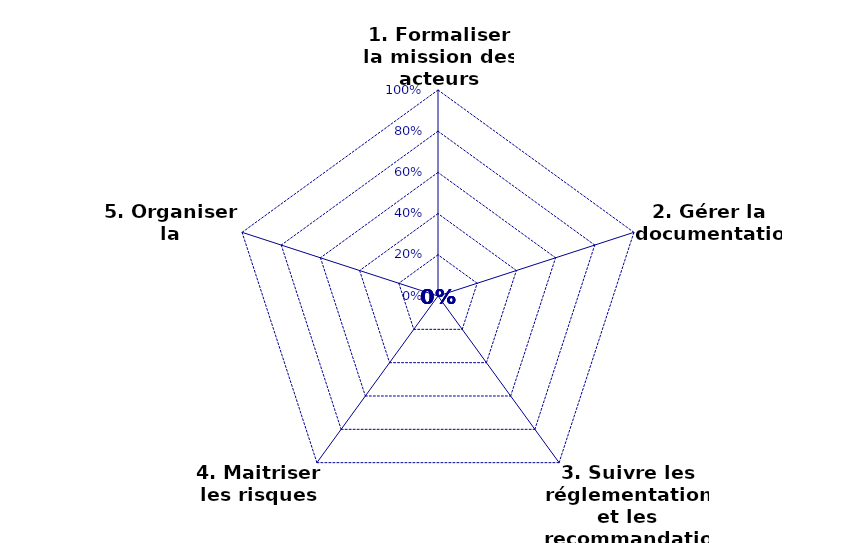
| Category | Moy+ET | Moyenne | Moy-ET |
|---|---|---|---|
| 1. Formaliser la mission des acteurs | 0 | 0 | 0 |
| 2. Gérer la documentation | 0 | 0 | 0 |
| 3. Suivre les réglementation et les recommandations | 0 | 0 | 0 |
| 4. Maitriser les risques des DM | 0 | 0 | 0 |
| 5. Organiser la maintenance | 0 | 0 | 0 |